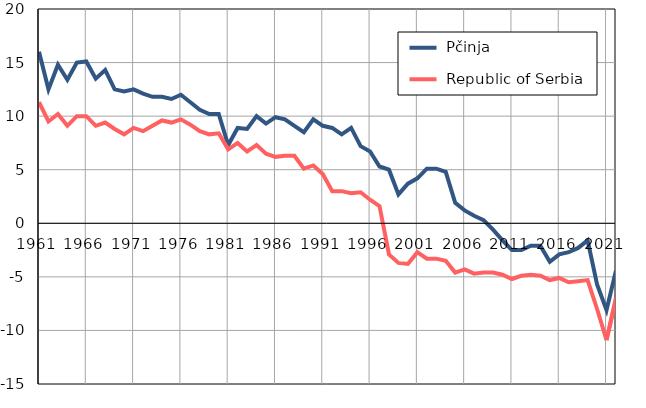
| Category |  Pčinja |  Republic of Serbia |
|---|---|---|
| 1961.0 | 16 | 11.3 |
| 1962.0 | 12.5 | 9.5 |
| 1963.0 | 14.8 | 10.2 |
| 1964.0 | 13.4 | 9.1 |
| 1965.0 | 15 | 10 |
| 1966.0 | 15.1 | 10 |
| 1967.0 | 13.5 | 9.1 |
| 1968.0 | 14.3 | 9.4 |
| 1969.0 | 12.5 | 8.8 |
| 1970.0 | 12.3 | 8.3 |
| 1971.0 | 12.5 | 8.9 |
| 1972.0 | 12.1 | 8.6 |
| 1973.0 | 11.8 | 9.1 |
| 1974.0 | 11.8 | 9.6 |
| 1975.0 | 11.6 | 9.4 |
| 1976.0 | 12 | 9.7 |
| 1977.0 | 11.3 | 9.2 |
| 1978.0 | 10.6 | 8.6 |
| 1979.0 | 10.2 | 8.3 |
| 1980.0 | 10.2 | 8.4 |
| 1981.0 | 7.3 | 6.9 |
| 1982.0 | 8.9 | 7.5 |
| 1983.0 | 8.8 | 6.7 |
| 1984.0 | 10 | 7.3 |
| 1985.0 | 9.3 | 6.5 |
| 1986.0 | 9.9 | 6.2 |
| 1987.0 | 9.7 | 6.3 |
| 1988.0 | 9.1 | 6.3 |
| 1989.0 | 8.5 | 5.1 |
| 1990.0 | 9.7 | 5.4 |
| 1991.0 | 9.1 | 4.6 |
| 1992.0 | 8.9 | 3 |
| 1993.0 | 8.3 | 3 |
| 1994.0 | 8.9 | 2.8 |
| 1995.0 | 7.2 | 2.9 |
| 1996.0 | 6.7 | 2.2 |
| 1997.0 | 5.3 | 1.6 |
| 1998.0 | 5 | -2.9 |
| 1999.0 | 2.7 | -3.7 |
| 2000.0 | 3.7 | -3.8 |
| 2001.0 | 4.2 | -2.7 |
| 2002.0 | 5.1 | -3.3 |
| 2003.0 | 5.1 | -3.3 |
| 2004.0 | 4.8 | -3.5 |
| 2005.0 | 1.9 | -4.6 |
| 2006.0 | 1.2 | -4.3 |
| 2007.0 | 0.7 | -4.7 |
| 2008.0 | 0.3 | -4.6 |
| 2009.0 | -0.6 | -4.6 |
| 2010.0 | -1.6 | -4.8 |
| 2011.0 | -2.5 | -5.2 |
| 2012.0 | -2.5 | -4.9 |
| 2013.0 | -2.1 | -4.8 |
| 2014.0 | -2.1 | -4.9 |
| 2015.0 | -3.6 | -5.3 |
| 2016.0 | -2.9 | -5.1 |
| 2017.0 | -2.7 | -5.5 |
| 2018.0 | -2.3 | -5.4 |
| 2019.0 | -1.6 | -5.3 |
| 2020.0 | -5.7 | -8 |
| 2021.0 | -8.1 | -10.9 |
| 2022.0 | -4.4 | -7 |